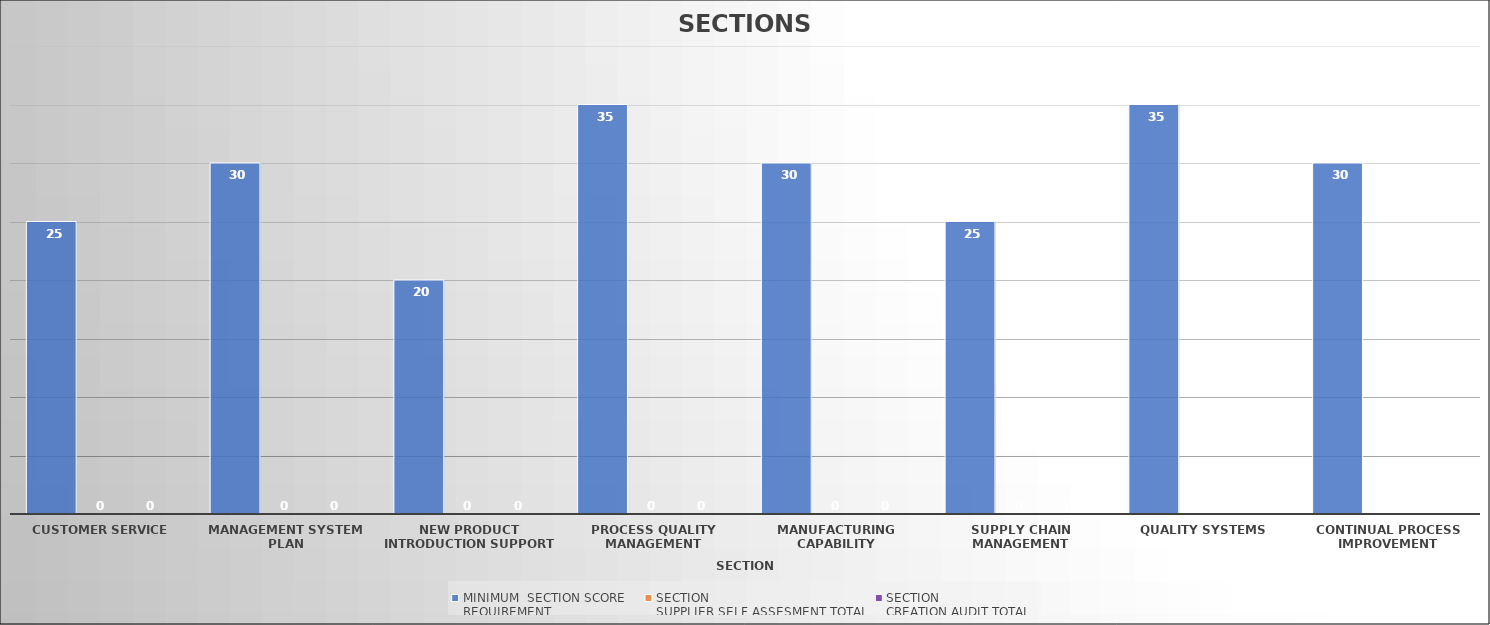
| Category | MINIMUM  SECTION SCORE 
REQUIREMENT | SECTION
SUPPLIER SELF ASSESMENT TOTAL | SECTION 
CREATION AUDIT TOTAL |
|---|---|---|---|
| Customer Service | 25 | 0 | 0 |
| Management System Plan | 30 | 0 | 0 |
| New Product Introduction Support | 20 | 0 | 0 |
| Process Quality Management | 35 | 0 | 0 |
| Manufacturing Capability | 30 | 0 | 0 |
| Supply Chain Management | 25 | 0 | 0 |
| Quality Systems | 35 | 0 | 0 |
| Continual Process Improvement | 30 | 0 | 0 |